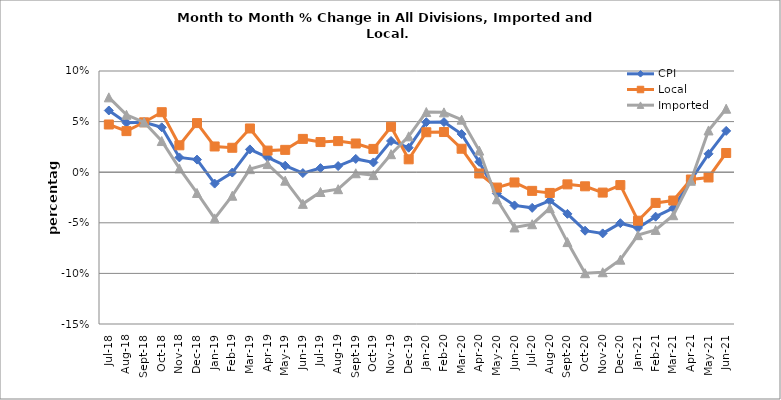
| Category | CPI | Local | Imported |
|---|---|---|---|
| 2018-07-01 | 0.061 | 0.047 | 0.074 |
| 2018-08-01 | 0.049 | 0.041 | 0.057 |
| 2018-09-01 | 0.049 | 0.049 | 0.049 |
| 2018-10-01 | 0.044 | 0.059 | 0.031 |
| 2018-11-01 | 0.015 | 0.027 | 0.004 |
| 2018-12-01 | 0.012 | 0.049 | -0.021 |
| 2019-01-01 | -0.011 | 0.025 | -0.046 |
| 2019-02-01 | 0 | 0.024 | -0.023 |
| 2019-03-01 | 0.023 | 0.043 | 0.003 |
| 2019-04-01 | 0.015 | 0.021 | 0.008 |
| 2019-05-01 | 0.006 | 0.022 | -0.008 |
| 2019-06-01 | -0.001 | 0.033 | -0.031 |
| 2019-07-01 | 0.004 | 0.03 | -0.02 |
| 2019-08-01 | 0.006 | 0.031 | -0.017 |
| 2019-09-01 | 0.013 | 0.028 | -0.001 |
| 2019-10-01 | 0.01 | 0.023 | -0.003 |
| 2019-11-01 | 0.031 | 0.045 | 0.018 |
| 2019-12-01 | 0.024 | 0.013 | 0.035 |
| 2020-01-01 | 0.049 | 0.039 | 0.059 |
| 2020-02-01 | 0.05 | 0.04 | 0.059 |
| 2020-03-01 | 0.038 | 0.023 | 0.052 |
| 2020-04-01 | 0.01 | -0.001 | 0.021 |
| 2020-05-01 | -0.021 | -0.015 | -0.027 |
| 2020-06-01 | -0.033 | -0.01 | -0.055 |
| 2020-07-01 | -0.035 | -0.018 | -0.051 |
| 2020-08-01 | -0.028 | -0.02 | -0.036 |
| 2020-09-01 | -0.041 | -0.012 | -0.069 |
| 2020-10-01 | -0.058 | -0.014 | -0.1 |
| 2020-11-01 | -0.06 | -0.02 | -0.099 |
| 2020-12-01 | -0.05 | -0.013 | -0.086 |
| 2021-01-01 | -0.055 | -0.048 | -0.062 |
| 2021-02-01 | -0.044 | -0.03 | -0.057 |
| 2021-03-01 | -0.035 | -0.028 | -0.043 |
| 2021-04-01 | -0.008 | -0.007 | -0.008 |
| 2021-05-01 | 0.018 | -0.005 | 0.041 |
| 2021-06-01 | 0.041 | 0.019 | 0.063 |